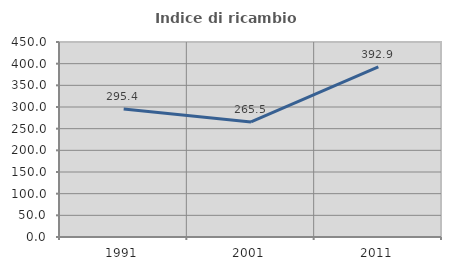
| Category | Indice di ricambio occupazionale  |
|---|---|
| 1991.0 | 295.413 |
| 2001.0 | 265.487 |
| 2011.0 | 392.857 |